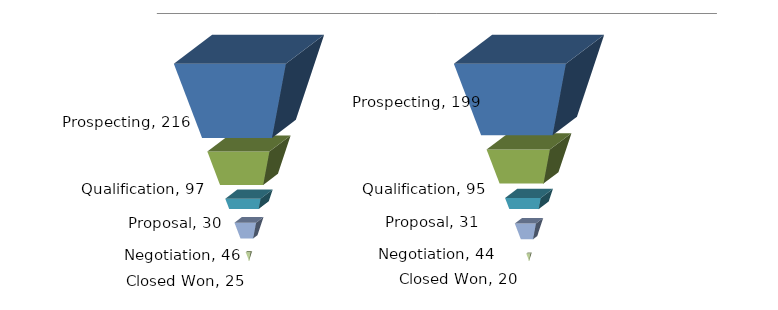
| Category | Prospecting | Spacer | Qualification | Proposal | Negotiation | Closed Won |
|---|---|---|---|---|---|---|
| USD (000's) | 216 | 40 | 97 | 30 | 46 | 25 |
| USD (000's) | 199 | 40 | 95 | 31 | 44 | 20 |